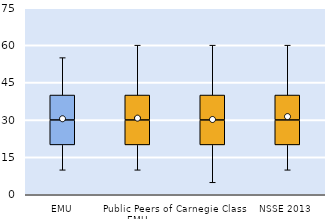
| Category | 25th | 50th | 75th |
|---|---|---|---|
| EMU | 20 | 10 | 10 |
| Public Peers of EMU | 20 | 10 | 10 |
| Carnegie Class | 20 | 10 | 10 |
| NSSE 2013 | 20 | 10 | 10 |